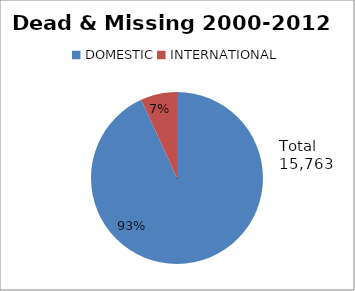
| Category | Series 0 |
|---|---|
| DOMESTIC | 14683 |
| INTERNATIONAL | 1080 |